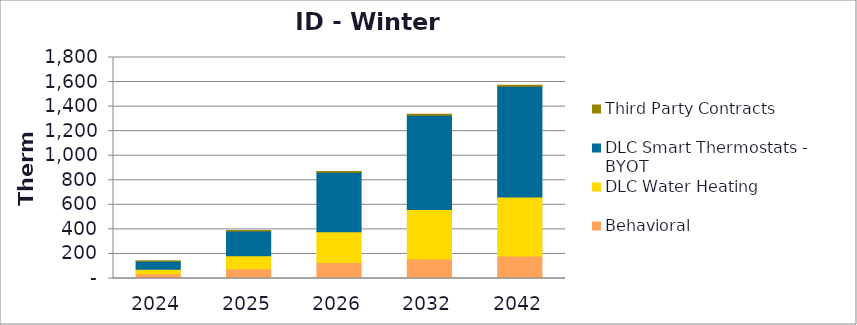
| Category | Behavioral | DLC Water Heating | DLC Smart Thermostats - BYOT | Third Party Contracts |
|---|---|---|---|---|
| 2024.0 | 39.658 | 34.765 | 66.177 | 2.037 |
| 2025.0 | 78.786 | 106.146 | 202.717 | 4.072 |
| 2026.0 | 129.857 | 251.805 | 483.517 | 6.924 |
| 2032.0 | 159.149 | 403.504 | 766.175 | 8.166 |
| 2042.0 | 182.479 | 481.875 | 902.099 | 8.198 |